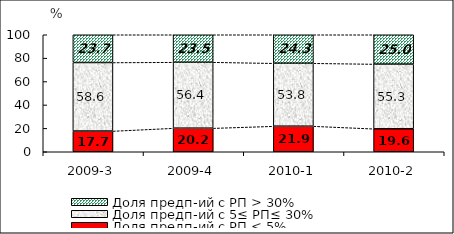
| Category | Доля предп-ий с РП < 5% | Доля предп-ий с 5≤ РП≤ 30% | Доля предп-ий с РП > 30% |
|---|---|---|---|
| 2009-3 | 17.709 | 58.579 | 23.712 |
| 2009-4 | 20.166 | 56.376 | 23.457 |
| 2010-1 | 21.869 | 53.785 | 24.346 |
| 2010-2 | 19.63 | 55.325 | 25.045 |